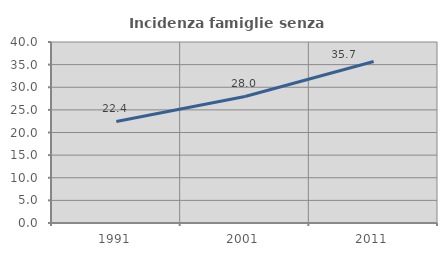
| Category | Incidenza famiglie senza nuclei |
|---|---|
| 1991.0 | 22.443 |
| 2001.0 | 27.958 |
| 2011.0 | 35.697 |